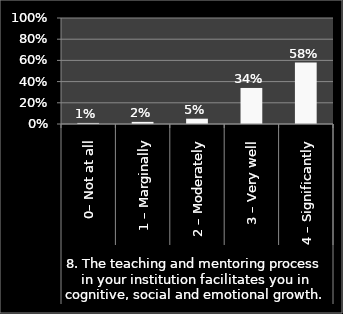
| Category | Series 0 |
|---|---|
| 0 | 0.01 |
| 1 | 0.02 |
| 2 | 0.05 |
| 3 | 0.34 |
| 4 | 0.58 |